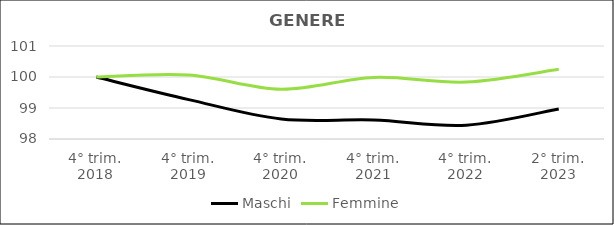
| Category | Maschi | Femmine |
|---|---|---|
| 4° trim.
2018 | 100 | 100 |
| 4° trim.
2019 | 99.271 | 100.066 |
| 4° trim.
2020 | 98.646 | 99.606 |
| 4° trim.
2021 | 98.613 | 99.987 |
| 4° trim.
2022 | 98.447 | 99.836 |
| 2° trim.
2023 | 98.97 | 100.248 |